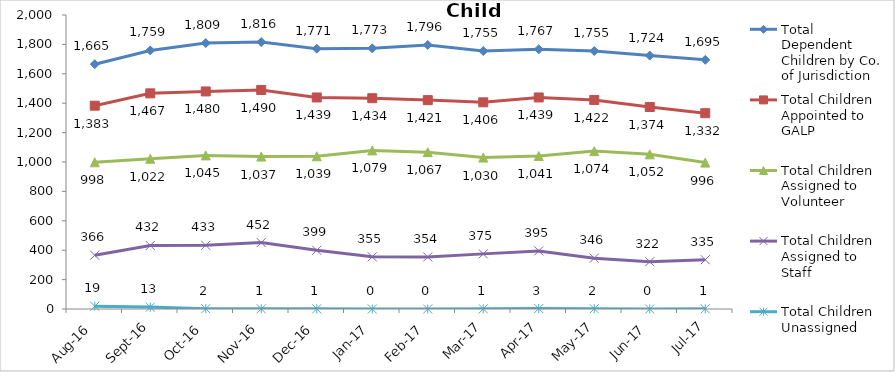
| Category | Total Dependent Children by Co. of Jurisdiction | Total Children Appointed to GALP | Total Children Assigned to Volunteer | Total Children Assigned to Staff | Total Children Unassigned |
|---|---|---|---|---|---|
| Aug-16 | 1665 | 1383 | 998 | 366 | 19 |
| Sep-16 | 1759 | 1467 | 1022 | 432 | 13 |
| Oct-16 | 1809 | 1480 | 1045 | 433 | 2 |
| Nov-16 | 1816 | 1490 | 1037 | 452 | 1 |
| Dec-16 | 1771 | 1439 | 1039 | 399 | 1 |
| Jan-17 | 1773 | 1434 | 1079 | 355 | 0 |
| Feb-17 | 1796 | 1421 | 1067 | 354 | 0 |
| Mar-17 | 1755 | 1406 | 1030 | 375 | 1 |
| Apr-17 | 1767 | 1439 | 1041 | 395 | 3 |
| May-17 | 1755 | 1422 | 1074 | 346 | 2 |
| Jun-17 | 1724 | 1374 | 1052 | 322 | 0 |
| Jul-17 | 1695 | 1332 | 996 | 335 | 1 |